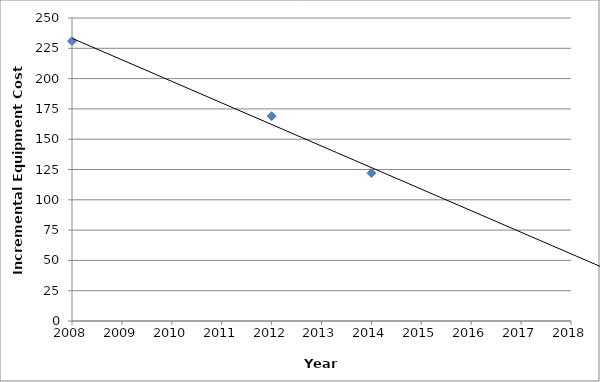
| Category | Refrigerated Case EC Motor Incremental Costs |
|---|---|
| 2012.0 | 169 |
| 2014.0 | 122 |
| 2008.0 | 231 |